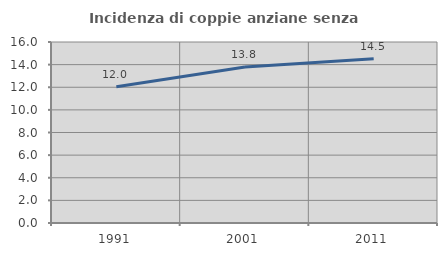
| Category | Incidenza di coppie anziane senza figli  |
|---|---|
| 1991.0 | 12.048 |
| 2001.0 | 13.793 |
| 2011.0 | 14.514 |